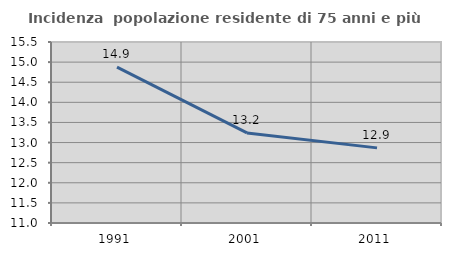
| Category | Incidenza  popolazione residente di 75 anni e più |
|---|---|
| 1991.0 | 14.873 |
| 2001.0 | 13.24 |
| 2011.0 | 12.868 |